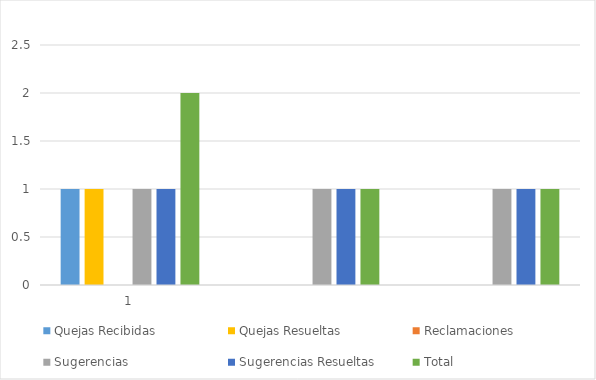
| Category | Quejas Recibidas | Quejas Resueltas | Reclamaciones | Sugerencias | Sugerencias Resueltas | Total |
|---|---|---|---|---|---|---|
| 1.0 | 1 | 1 | 0 | 1 | 1 | 2 |